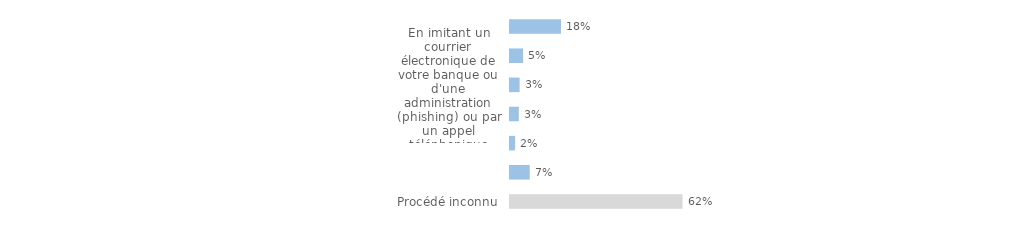
| Category | Series 0 |
|---|---|
| Procédé inconnu | 0.616 |
| Autres procédés | 0.071 |
| Auprès d'un établissement bancaire ou commercial (piratage de données) | 0.018 |
| À partir d'un retrait dans un distributeur automatique (par exemple en plaçant un dispositif qui enregistre votre numéro de carte bancaire et votre code secret) | 0.031 |
| En imitant un courrier électronique de votre banque ou d'une administration (phishing) ou par un appel téléphonique | 0.034 |
| Lors d'un achat que vous avez effectué dans un commerce traditionnel  | 0.047 |
| Lors d'un achat ou d'une réservation sur internet | 0.182 |